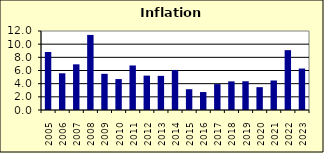
| Category | 7.7 |
|---|---|
| 2005.0 | 8.809 |
| 2006.0 | 5.578 |
| 2007.0 | 6.936 |
| 2008.0 | 11.403 |
| 2009.0 | 5.496 |
| 2010.0 | 4.699 |
| 2011.0 | 6.762 |
| 2012.0 | 5.218 |
| 2013.0 | 5.186 |
| 2014.0 | 6.082 |
| 2015.0 | 3.158 |
| 2016.0 | 2.725 |
| 2017.0 | 3.934 |
| 2018.0 | 4.348 |
| 2019.0 | 4.365 |
| 2020.0 | 3.468 |
| 2021.0 | 4.481 |
| 2022.0 | 9.09 |
| 2023.0 | 6.3 |